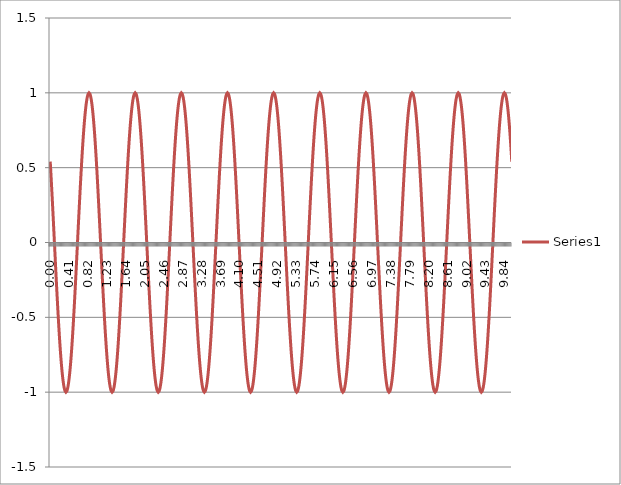
| Category | Series 1 |
|---|---|
| 0.0 | 0.54 |
| 0.01 | 0.486 |
| 0.02 | 0.431 |
| 0.03 | 0.373 |
| 0.04 | 0.314 |
| 0.05 | 0.254 |
| 0.060000000000000005 | 0.193 |
| 0.07 | 0.131 |
| 0.08 | 0.068 |
| 0.09 | 0.005 |
| 0.09999999999999999 | -0.057 |
| 0.10999999999999999 | -0.12 |
| 0.11999999999999998 | -0.182 |
| 0.12999999999999998 | -0.244 |
| 0.13999999999999999 | -0.304 |
| 0.15 | -0.363 |
| 0.16 | -0.421 |
| 0.17 | -0.477 |
| 0.18000000000000002 | -0.531 |
| 0.19000000000000003 | -0.583 |
| 0.20000000000000004 | -0.633 |
| 0.21000000000000005 | -0.681 |
| 0.22000000000000006 | -0.725 |
| 0.23000000000000007 | -0.767 |
| 0.24000000000000007 | -0.806 |
| 0.25000000000000006 | -0.841 |
| 0.26000000000000006 | -0.874 |
| 0.2700000000000001 | -0.903 |
| 0.2800000000000001 | -0.928 |
| 0.2900000000000001 | -0.949 |
| 0.3000000000000001 | -0.967 |
| 0.3100000000000001 | -0.981 |
| 0.3200000000000001 | -0.991 |
| 0.3300000000000001 | -0.998 |
| 0.34000000000000014 | -1 |
| 0.35000000000000014 | -0.998 |
| 0.36000000000000015 | -0.993 |
| 0.37000000000000016 | -0.983 |
| 0.38000000000000017 | -0.97 |
| 0.3900000000000002 | -0.953 |
| 0.4000000000000002 | -0.932 |
| 0.4100000000000002 | -0.907 |
| 0.4200000000000002 | -0.879 |
| 0.4300000000000002 | -0.847 |
| 0.4400000000000002 | -0.812 |
| 0.45000000000000023 | -0.774 |
| 0.46000000000000024 | -0.733 |
| 0.47000000000000025 | -0.688 |
| 0.48000000000000026 | -0.642 |
| 0.49000000000000027 | -0.592 |
| 0.5000000000000002 | -0.54 |
| 0.5100000000000002 | -0.486 |
| 0.5200000000000002 | -0.431 |
| 0.5300000000000002 | -0.373 |
| 0.5400000000000003 | -0.314 |
| 0.5500000000000003 | -0.254 |
| 0.5600000000000003 | -0.193 |
| 0.5700000000000003 | -0.131 |
| 0.5800000000000003 | -0.068 |
| 0.5900000000000003 | -0.005 |
| 0.6000000000000003 | 0.057 |
| 0.6100000000000003 | 0.12 |
| 0.6200000000000003 | 0.182 |
| 0.6300000000000003 | 0.244 |
| 0.6400000000000003 | 0.304 |
| 0.6500000000000004 | 0.363 |
| 0.6600000000000004 | 0.421 |
| 0.6700000000000004 | 0.477 |
| 0.6800000000000004 | 0.531 |
| 0.6900000000000004 | 0.583 |
| 0.7000000000000004 | 0.633 |
| 0.7100000000000004 | 0.681 |
| 0.7200000000000004 | 0.725 |
| 0.7300000000000004 | 0.767 |
| 0.7400000000000004 | 0.806 |
| 0.7500000000000004 | 0.841 |
| 0.7600000000000005 | 0.874 |
| 0.7700000000000005 | 0.903 |
| 0.7800000000000005 | 0.928 |
| 0.7900000000000005 | 0.949 |
| 0.8000000000000005 | 0.967 |
| 0.8100000000000005 | 0.981 |
| 0.8200000000000005 | 0.991 |
| 0.8300000000000005 | 0.998 |
| 0.8400000000000005 | 1 |
| 0.8500000000000005 | 0.998 |
| 0.8600000000000005 | 0.993 |
| 0.8700000000000006 | 0.983 |
| 0.8800000000000006 | 0.97 |
| 0.8900000000000006 | 0.953 |
| 0.9000000000000006 | 0.932 |
| 0.9100000000000006 | 0.907 |
| 0.9200000000000006 | 0.879 |
| 0.9300000000000006 | 0.847 |
| 0.9400000000000006 | 0.812 |
| 0.9500000000000006 | 0.774 |
| 0.9600000000000006 | 0.733 |
| 0.9700000000000006 | 0.688 |
| 0.9800000000000006 | 0.642 |
| 0.9900000000000007 | 0.592 |
| 1.0000000000000007 | 0.54 |
| 1.0100000000000007 | 0.486 |
| 1.0200000000000007 | 0.431 |
| 1.0300000000000007 | 0.373 |
| 1.0400000000000007 | 0.314 |
| 1.0500000000000007 | 0.254 |
| 1.0600000000000007 | 0.193 |
| 1.0700000000000007 | 0.131 |
| 1.0800000000000007 | 0.068 |
| 1.0900000000000007 | 0.005 |
| 1.1000000000000008 | -0.057 |
| 1.1100000000000008 | -0.12 |
| 1.1200000000000008 | -0.182 |
| 1.1300000000000008 | -0.244 |
| 1.1400000000000008 | -0.304 |
| 1.1500000000000008 | -0.363 |
| 1.1600000000000008 | -0.421 |
| 1.1700000000000008 | -0.477 |
| 1.1800000000000008 | -0.531 |
| 1.1900000000000008 | -0.583 |
| 1.2000000000000008 | -0.633 |
| 1.2100000000000009 | -0.681 |
| 1.2200000000000009 | -0.725 |
| 1.2300000000000009 | -0.767 |
| 1.2400000000000009 | -0.806 |
| 1.2500000000000009 | -0.841 |
| 1.260000000000001 | -0.874 |
| 1.270000000000001 | -0.903 |
| 1.280000000000001 | -0.928 |
| 1.290000000000001 | -0.949 |
| 1.300000000000001 | -0.967 |
| 1.310000000000001 | -0.981 |
| 1.320000000000001 | -0.991 |
| 1.330000000000001 | -0.998 |
| 1.340000000000001 | -1 |
| 1.350000000000001 | -0.998 |
| 1.360000000000001 | -0.993 |
| 1.370000000000001 | -0.983 |
| 1.380000000000001 | -0.97 |
| 1.390000000000001 | -0.953 |
| 1.400000000000001 | -0.932 |
| 1.410000000000001 | -0.907 |
| 1.420000000000001 | -0.879 |
| 1.430000000000001 | -0.847 |
| 1.440000000000001 | -0.812 |
| 1.450000000000001 | -0.774 |
| 1.460000000000001 | -0.733 |
| 1.470000000000001 | -0.688 |
| 1.480000000000001 | -0.642 |
| 1.490000000000001 | -0.592 |
| 1.500000000000001 | -0.54 |
| 1.5100000000000011 | -0.486 |
| 1.5200000000000011 | -0.431 |
| 1.5300000000000011 | -0.373 |
| 1.5400000000000011 | -0.314 |
| 1.5500000000000012 | -0.254 |
| 1.5600000000000012 | -0.193 |
| 1.5700000000000012 | -0.131 |
| 1.5800000000000012 | -0.068 |
| 1.5900000000000012 | -0.005 |
| 1.6000000000000012 | 0.057 |
| 1.6100000000000012 | 0.12 |
| 1.6200000000000012 | 0.182 |
| 1.6300000000000012 | 0.244 |
| 1.6400000000000012 | 0.304 |
| 1.6500000000000012 | 0.363 |
| 1.6600000000000013 | 0.421 |
| 1.6700000000000013 | 0.477 |
| 1.6800000000000013 | 0.531 |
| 1.6900000000000013 | 0.583 |
| 1.7000000000000013 | 0.633 |
| 1.7100000000000013 | 0.681 |
| 1.7200000000000013 | 0.725 |
| 1.7300000000000013 | 0.767 |
| 1.7400000000000013 | 0.806 |
| 1.7500000000000013 | 0.841 |
| 1.7600000000000013 | 0.874 |
| 1.7700000000000014 | 0.903 |
| 1.7800000000000014 | 0.928 |
| 1.7900000000000014 | 0.949 |
| 1.8000000000000014 | 0.967 |
| 1.8100000000000014 | 0.981 |
| 1.8200000000000014 | 0.991 |
| 1.8300000000000014 | 0.998 |
| 1.8400000000000014 | 1 |
| 1.8500000000000014 | 0.998 |
| 1.8600000000000014 | 0.993 |
| 1.8700000000000014 | 0.983 |
| 1.8800000000000014 | 0.97 |
| 1.8900000000000015 | 0.953 |
| 1.9000000000000015 | 0.932 |
| 1.9100000000000015 | 0.907 |
| 1.9200000000000015 | 0.879 |
| 1.9300000000000015 | 0.847 |
| 1.9400000000000015 | 0.812 |
| 1.9500000000000015 | 0.774 |
| 1.9600000000000015 | 0.733 |
| 1.9700000000000015 | 0.688 |
| 1.9800000000000015 | 0.642 |
| 1.9900000000000015 | 0.592 |
| 2.0000000000000013 | 0.54 |
| 2.010000000000001 | 0.486 |
| 2.020000000000001 | 0.431 |
| 2.0300000000000007 | 0.373 |
| 2.0400000000000005 | 0.314 |
| 2.0500000000000003 | 0.254 |
| 2.06 | 0.193 |
| 2.07 | 0.131 |
| 2.0799999999999996 | 0.068 |
| 2.0899999999999994 | 0.005 |
| 2.099999999999999 | -0.057 |
| 2.109999999999999 | -0.12 |
| 2.1199999999999988 | -0.182 |
| 2.1299999999999986 | -0.244 |
| 2.1399999999999983 | -0.304 |
| 2.149999999999998 | -0.363 |
| 2.159999999999998 | -0.421 |
| 2.1699999999999977 | -0.477 |
| 2.1799999999999975 | -0.531 |
| 2.1899999999999973 | -0.583 |
| 2.199999999999997 | -0.633 |
| 2.209999999999997 | -0.681 |
| 2.2199999999999966 | -0.725 |
| 2.2299999999999964 | -0.767 |
| 2.239999999999996 | -0.806 |
| 2.249999999999996 | -0.841 |
| 2.259999999999996 | -0.874 |
| 2.2699999999999956 | -0.903 |
| 2.2799999999999954 | -0.928 |
| 2.289999999999995 | -0.949 |
| 2.299999999999995 | -0.967 |
| 2.3099999999999947 | -0.981 |
| 2.3199999999999945 | -0.991 |
| 2.3299999999999943 | -0.998 |
| 2.339999999999994 | -1 |
| 2.349999999999994 | -0.998 |
| 2.3599999999999937 | -0.993 |
| 2.3699999999999934 | -0.983 |
| 2.3799999999999932 | -0.97 |
| 2.389999999999993 | -0.953 |
| 2.399999999999993 | -0.932 |
| 2.4099999999999926 | -0.907 |
| 2.4199999999999924 | -0.879 |
| 2.429999999999992 | -0.847 |
| 2.439999999999992 | -0.812 |
| 2.4499999999999917 | -0.774 |
| 2.4599999999999915 | -0.733 |
| 2.4699999999999913 | -0.688 |
| 2.479999999999991 | -0.642 |
| 2.489999999999991 | -0.592 |
| 2.4999999999999907 | -0.54 |
| 2.5099999999999905 | -0.486 |
| 2.5199999999999902 | -0.431 |
| 2.52999999999999 | -0.373 |
| 2.53999999999999 | -0.314 |
| 2.5499999999999896 | -0.254 |
| 2.5599999999999894 | -0.193 |
| 2.569999999999989 | -0.131 |
| 2.579999999999989 | -0.068 |
| 2.5899999999999888 | -0.005 |
| 2.5999999999999885 | 0.057 |
| 2.6099999999999883 | 0.12 |
| 2.619999999999988 | 0.182 |
| 2.629999999999988 | 0.244 |
| 2.6399999999999877 | 0.304 |
| 2.6499999999999875 | 0.363 |
| 2.6599999999999873 | 0.421 |
| 2.669999999999987 | 0.477 |
| 2.679999999999987 | 0.531 |
| 2.6899999999999866 | 0.583 |
| 2.6999999999999864 | 0.633 |
| 2.709999999999986 | 0.681 |
| 2.719999999999986 | 0.725 |
| 2.7299999999999858 | 0.767 |
| 2.7399999999999856 | 0.806 |
| 2.7499999999999853 | 0.841 |
| 2.759999999999985 | 0.874 |
| 2.769999999999985 | 0.903 |
| 2.7799999999999847 | 0.928 |
| 2.7899999999999845 | 0.949 |
| 2.7999999999999843 | 0.967 |
| 2.809999999999984 | 0.981 |
| 2.819999999999984 | 0.991 |
| 2.8299999999999836 | 0.998 |
| 2.8399999999999834 | 1 |
| 2.849999999999983 | 0.998 |
| 2.859999999999983 | 0.993 |
| 2.869999999999983 | 0.983 |
| 2.8799999999999826 | 0.97 |
| 2.8899999999999824 | 0.953 |
| 2.899999999999982 | 0.932 |
| 2.909999999999982 | 0.907 |
| 2.9199999999999817 | 0.879 |
| 2.9299999999999815 | 0.847 |
| 2.9399999999999813 | 0.812 |
| 2.949999999999981 | 0.774 |
| 2.959999999999981 | 0.733 |
| 2.9699999999999807 | 0.688 |
| 2.9799999999999804 | 0.642 |
| 2.9899999999999802 | 0.592 |
| 2.99999999999998 | 0.54 |
| 3.00999999999998 | 0.486 |
| 3.0199999999999796 | 0.431 |
| 3.0299999999999794 | 0.373 |
| 3.039999999999979 | 0.314 |
| 3.049999999999979 | 0.254 |
| 3.0599999999999787 | 0.193 |
| 3.0699999999999785 | 0.131 |
| 3.0799999999999783 | 0.068 |
| 3.089999999999978 | 0.005 |
| 3.099999999999978 | -0.057 |
| 3.1099999999999777 | -0.12 |
| 3.1199999999999775 | -0.182 |
| 3.1299999999999772 | -0.244 |
| 3.139999999999977 | -0.304 |
| 3.149999999999977 | -0.363 |
| 3.1599999999999766 | -0.421 |
| 3.1699999999999764 | -0.477 |
| 3.179999999999976 | -0.531 |
| 3.189999999999976 | -0.583 |
| 3.1999999999999758 | -0.633 |
| 3.2099999999999755 | -0.681 |
| 3.2199999999999753 | -0.725 |
| 3.229999999999975 | -0.767 |
| 3.239999999999975 | -0.806 |
| 3.2499999999999747 | -0.841 |
| 3.2599999999999745 | -0.874 |
| 3.2699999999999743 | -0.903 |
| 3.279999999999974 | -0.928 |
| 3.289999999999974 | -0.949 |
| 3.2999999999999736 | -0.967 |
| 3.3099999999999734 | -0.981 |
| 3.319999999999973 | -0.991 |
| 3.329999999999973 | -0.998 |
| 3.3399999999999728 | -1 |
| 3.3499999999999726 | -0.998 |
| 3.3599999999999723 | -0.993 |
| 3.369999999999972 | -0.983 |
| 3.379999999999972 | -0.97 |
| 3.3899999999999717 | -0.953 |
| 3.3999999999999715 | -0.932 |
| 3.4099999999999713 | -0.907 |
| 3.419999999999971 | -0.879 |
| 3.429999999999971 | -0.847 |
| 3.4399999999999706 | -0.812 |
| 3.4499999999999704 | -0.774 |
| 3.45999999999997 | -0.733 |
| 3.46999999999997 | -0.688 |
| 3.47999999999997 | -0.642 |
| 3.4899999999999696 | -0.592 |
| 3.4999999999999694 | -0.54 |
| 3.509999999999969 | -0.486 |
| 3.519999999999969 | -0.431 |
| 3.5299999999999687 | -0.373 |
| 3.5399999999999685 | -0.314 |
| 3.5499999999999683 | -0.254 |
| 3.559999999999968 | -0.193 |
| 3.569999999999968 | -0.131 |
| 3.5799999999999677 | -0.068 |
| 3.5899999999999674 | -0.005 |
| 3.5999999999999672 | 0.057 |
| 3.609999999999967 | 0.12 |
| 3.619999999999967 | 0.182 |
| 3.6299999999999666 | 0.244 |
| 3.6399999999999664 | 0.304 |
| 3.649999999999966 | 0.363 |
| 3.659999999999966 | 0.421 |
| 3.6699999999999657 | 0.477 |
| 3.6799999999999655 | 0.531 |
| 3.6899999999999653 | 0.583 |
| 3.699999999999965 | 0.633 |
| 3.709999999999965 | 0.681 |
| 3.7199999999999647 | 0.725 |
| 3.7299999999999645 | 0.767 |
| 3.7399999999999642 | 0.806 |
| 3.749999999999964 | 0.841 |
| 3.759999999999964 | 0.874 |
| 3.7699999999999636 | 0.903 |
| 3.7799999999999634 | 0.928 |
| 3.789999999999963 | 0.949 |
| 3.799999999999963 | 0.967 |
| 3.8099999999999627 | 0.981 |
| 3.8199999999999625 | 0.991 |
| 3.8299999999999623 | 0.998 |
| 3.839999999999962 | 1 |
| 3.849999999999962 | 0.998 |
| 3.8599999999999617 | 0.993 |
| 3.8699999999999615 | 0.983 |
| 3.8799999999999613 | 0.97 |
| 3.889999999999961 | 0.953 |
| 3.899999999999961 | 0.932 |
| 3.9099999999999606 | 0.907 |
| 3.9199999999999604 | 0.879 |
| 3.92999999999996 | 0.847 |
| 3.93999999999996 | 0.812 |
| 3.9499999999999598 | 0.774 |
| 3.9599999999999596 | 0.733 |
| 3.9699999999999593 | 0.688 |
| 3.979999999999959 | 0.642 |
| 3.989999999999959 | 0.592 |
| 3.9999999999999587 | 0.54 |
| 4.009999999999959 | 0.486 |
| 4.019999999999959 | 0.431 |
| 4.0299999999999585 | 0.373 |
| 4.039999999999958 | 0.314 |
| 4.049999999999958 | 0.254 |
| 4.059999999999958 | 0.193 |
| 4.069999999999958 | 0.131 |
| 4.079999999999957 | 0.068 |
| 4.089999999999957 | 0.005 |
| 4.099999999999957 | -0.057 |
| 4.109999999999957 | -0.12 |
| 4.119999999999957 | -0.182 |
| 4.129999999999956 | -0.244 |
| 4.139999999999956 | -0.304 |
| 4.149999999999956 | -0.363 |
| 4.159999999999956 | -0.421 |
| 4.1699999999999555 | -0.477 |
| 4.179999999999955 | -0.531 |
| 4.189999999999955 | -0.583 |
| 4.199999999999955 | -0.633 |
| 4.209999999999955 | -0.681 |
| 4.2199999999999545 | -0.725 |
| 4.229999999999954 | -0.767 |
| 4.239999999999954 | -0.806 |
| 4.249999999999954 | -0.841 |
| 4.259999999999954 | -0.874 |
| 4.269999999999953 | -0.903 |
| 4.279999999999953 | -0.928 |
| 4.289999999999953 | -0.949 |
| 4.299999999999953 | -0.967 |
| 4.3099999999999525 | -0.981 |
| 4.319999999999952 | -0.991 |
| 4.329999999999952 | -0.998 |
| 4.339999999999952 | -1 |
| 4.349999999999952 | -0.998 |
| 4.3599999999999515 | -0.993 |
| 4.369999999999951 | -0.983 |
| 4.379999999999951 | -0.97 |
| 4.389999999999951 | -0.953 |
| 4.399999999999951 | -0.932 |
| 4.40999999999995 | -0.907 |
| 4.41999999999995 | -0.879 |
| 4.42999999999995 | -0.847 |
| 4.43999999999995 | -0.812 |
| 4.4499999999999496 | -0.774 |
| 4.459999999999949 | -0.733 |
| 4.469999999999949 | -0.688 |
| 4.479999999999949 | -0.642 |
| 4.489999999999949 | -0.592 |
| 4.4999999999999485 | -0.54 |
| 4.509999999999948 | -0.486 |
| 4.519999999999948 | -0.431 |
| 4.529999999999948 | -0.373 |
| 4.539999999999948 | -0.314 |
| 4.549999999999947 | -0.254 |
| 4.559999999999947 | -0.193 |
| 4.569999999999947 | -0.131 |
| 4.579999999999947 | -0.068 |
| 4.589999999999947 | -0.005 |
| 4.599999999999946 | 0.057 |
| 4.609999999999946 | 0.12 |
| 4.619999999999946 | 0.182 |
| 4.629999999999946 | 0.244 |
| 4.6399999999999455 | 0.304 |
| 4.649999999999945 | 0.363 |
| 4.659999999999945 | 0.421 |
| 4.669999999999945 | 0.477 |
| 4.679999999999945 | 0.531 |
| 4.689999999999944 | 0.583 |
| 4.699999999999944 | 0.633 |
| 4.709999999999944 | 0.681 |
| 4.719999999999944 | 0.725 |
| 4.729999999999944 | 0.767 |
| 4.739999999999943 | 0.806 |
| 4.749999999999943 | 0.841 |
| 4.759999999999943 | 0.874 |
| 4.769999999999943 | 0.903 |
| 4.7799999999999425 | 0.928 |
| 4.789999999999942 | 0.949 |
| 4.799999999999942 | 0.967 |
| 4.809999999999942 | 0.981 |
| 4.819999999999942 | 0.991 |
| 4.8299999999999415 | 0.998 |
| 4.839999999999941 | 1 |
| 4.849999999999941 | 0.998 |
| 4.859999999999941 | 0.993 |
| 4.869999999999941 | 0.983 |
| 4.87999999999994 | 0.97 |
| 4.88999999999994 | 0.953 |
| 4.89999999999994 | 0.932 |
| 4.90999999999994 | 0.907 |
| 4.9199999999999395 | 0.879 |
| 4.929999999999939 | 0.847 |
| 4.939999999999939 | 0.812 |
| 4.949999999999939 | 0.774 |
| 4.959999999999939 | 0.733 |
| 4.9699999999999385 | 0.688 |
| 4.979999999999938 | 0.642 |
| 4.989999999999938 | 0.592 |
| 4.999999999999938 | 0.54 |
| 5.009999999999938 | 0.486 |
| 5.019999999999937 | 0.431 |
| 5.029999999999937 | 0.373 |
| 5.039999999999937 | 0.314 |
| 5.049999999999937 | 0.254 |
| 5.0599999999999365 | 0.193 |
| 5.069999999999936 | 0.131 |
| 5.079999999999936 | 0.068 |
| 5.089999999999936 | 0.005 |
| 5.099999999999936 | -0.057 |
| 5.1099999999999355 | -0.12 |
| 5.119999999999935 | -0.182 |
| 5.129999999999935 | -0.244 |
| 5.139999999999935 | -0.304 |
| 5.149999999999935 | -0.363 |
| 5.159999999999934 | -0.421 |
| 5.169999999999934 | -0.477 |
| 5.179999999999934 | -0.531 |
| 5.189999999999934 | -0.583 |
| 5.199999999999934 | -0.633 |
| 5.209999999999933 | -0.681 |
| 5.219999999999933 | -0.725 |
| 5.229999999999933 | -0.767 |
| 5.239999999999933 | -0.806 |
| 5.2499999999999325 | -0.841 |
| 5.259999999999932 | -0.874 |
| 5.269999999999932 | -0.903 |
| 5.279999999999932 | -0.928 |
| 5.289999999999932 | -0.949 |
| 5.299999999999931 | -0.967 |
| 5.309999999999931 | -0.981 |
| 5.319999999999931 | -0.991 |
| 5.329999999999931 | -0.998 |
| 5.339999999999931 | -1 |
| 5.34999999999993 | -0.998 |
| 5.35999999999993 | -0.993 |
| 5.36999999999993 | -0.983 |
| 5.37999999999993 | -0.97 |
| 5.3899999999999295 | -0.953 |
| 5.399999999999929 | -0.932 |
| 5.409999999999929 | -0.907 |
| 5.419999999999929 | -0.879 |
| 5.429999999999929 | -0.847 |
| 5.4399999999999284 | -0.812 |
| 5.449999999999928 | -0.774 |
| 5.459999999999928 | -0.733 |
| 5.469999999999928 | -0.688 |
| 5.479999999999928 | -0.642 |
| 5.489999999999927 | -0.592 |
| 5.499999999999927 | -0.54 |
| 5.509999999999927 | -0.486 |
| 5.519999999999927 | -0.431 |
| 5.5299999999999265 | -0.373 |
| 5.539999999999926 | -0.314 |
| 5.549999999999926 | -0.254 |
| 5.559999999999926 | -0.193 |
| 5.569999999999926 | -0.131 |
| 5.5799999999999255 | -0.068 |
| 5.589999999999925 | -0.005 |
| 5.599999999999925 | 0.057 |
| 5.609999999999925 | 0.12 |
| 5.619999999999925 | 0.182 |
| 5.629999999999924 | 0.244 |
| 5.639999999999924 | 0.304 |
| 5.649999999999924 | 0.363 |
| 5.659999999999924 | 0.421 |
| 5.6699999999999235 | 0.477 |
| 5.679999999999923 | 0.531 |
| 5.689999999999923 | 0.583 |
| 5.699999999999923 | 0.633 |
| 5.709999999999923 | 0.681 |
| 5.7199999999999225 | 0.725 |
| 5.729999999999922 | 0.767 |
| 5.739999999999922 | 0.806 |
| 5.749999999999922 | 0.841 |
| 5.759999999999922 | 0.874 |
| 5.769999999999921 | 0.903 |
| 5.779999999999921 | 0.928 |
| 5.789999999999921 | 0.949 |
| 5.799999999999921 | 0.967 |
| 5.809999999999921 | 0.981 |
| 5.81999999999992 | 0.991 |
| 5.82999999999992 | 0.998 |
| 5.83999999999992 | 1 |
| 5.84999999999992 | 0.998 |
| 5.8599999999999195 | 0.993 |
| 5.869999999999919 | 0.983 |
| 5.879999999999919 | 0.97 |
| 5.889999999999919 | 0.953 |
| 5.899999999999919 | 0.932 |
| 5.909999999999918 | 0.907 |
| 5.919999999999918 | 0.879 |
| 5.929999999999918 | 0.847 |
| 5.939999999999918 | 0.812 |
| 5.949999999999918 | 0.774 |
| 5.959999999999917 | 0.733 |
| 5.969999999999917 | 0.688 |
| 5.979999999999917 | 0.642 |
| 5.989999999999917 | 0.592 |
| 5.9999999999999165 | 0.54 |
| 6.009999999999916 | 0.486 |
| 6.019999999999916 | 0.431 |
| 6.029999999999916 | 0.373 |
| 6.039999999999916 | 0.314 |
| 6.0499999999999154 | 0.254 |
| 6.059999999999915 | 0.193 |
| 6.069999999999915 | 0.131 |
| 6.079999999999915 | 0.068 |
| 6.089999999999915 | 0.005 |
| 6.099999999999914 | -0.057 |
| 6.109999999999914 | -0.12 |
| 6.119999999999914 | -0.182 |
| 6.129999999999914 | -0.244 |
| 6.1399999999999135 | -0.304 |
| 6.149999999999913 | -0.363 |
| 6.159999999999913 | -0.421 |
| 6.169999999999913 | -0.477 |
| 6.179999999999913 | -0.531 |
| 6.1899999999999125 | -0.583 |
| 6.199999999999912 | -0.633 |
| 6.209999999999912 | -0.681 |
| 6.219999999999912 | -0.725 |
| 6.229999999999912 | -0.767 |
| 6.239999999999911 | -0.806 |
| 6.249999999999911 | -0.841 |
| 6.259999999999911 | -0.874 |
| 6.269999999999911 | -0.903 |
| 6.2799999999999105 | -0.928 |
| 6.28999999999991 | -0.949 |
| 6.29999999999991 | -0.967 |
| 6.30999999999991 | -0.981 |
| 6.31999999999991 | -0.991 |
| 6.3299999999999095 | -0.998 |
| 6.339999999999909 | -1 |
| 6.349999999999909 | -0.998 |
| 6.359999999999909 | -0.993 |
| 6.369999999999909 | -0.983 |
| 6.379999999999908 | -0.97 |
| 6.389999999999908 | -0.953 |
| 6.399999999999908 | -0.932 |
| 6.409999999999908 | -0.907 |
| 6.419999999999908 | -0.879 |
| 6.429999999999907 | -0.847 |
| 6.439999999999907 | -0.812 |
| 6.449999999999907 | -0.774 |
| 6.459999999999907 | -0.733 |
| 6.4699999999999065 | -0.688 |
| 6.479999999999906 | -0.642 |
| 6.489999999999906 | -0.592 |
| 6.499999999999906 | -0.54 |
| 6.509999999999906 | -0.486 |
| 6.519999999999905 | -0.431 |
| 6.529999999999905 | -0.373 |
| 6.539999999999905 | -0.314 |
| 6.549999999999905 | -0.254 |
| 6.559999999999905 | -0.193 |
| 6.569999999999904 | -0.131 |
| 6.579999999999904 | -0.068 |
| 6.589999999999904 | -0.005 |
| 6.599999999999904 | 0.057 |
| 6.6099999999999035 | 0.12 |
| 6.619999999999903 | 0.182 |
| 6.629999999999903 | 0.244 |
| 6.639999999999903 | 0.304 |
| 6.649999999999903 | 0.363 |
| 6.659999999999902 | 0.421 |
| 6.669999999999902 | 0.477 |
| 6.679999999999902 | 0.531 |
| 6.689999999999902 | 0.583 |
| 6.699999999999902 | 0.633 |
| 6.709999999999901 | 0.681 |
| 6.719999999999901 | 0.725 |
| 6.729999999999901 | 0.767 |
| 6.739999999999901 | 0.806 |
| 6.7499999999999005 | 0.841 |
| 6.7599999999999 | 0.874 |
| 6.7699999999999 | 0.903 |
| 6.7799999999999 | 0.928 |
| 6.7899999999999 | 0.949 |
| 6.7999999999998995 | 0.967 |
| 6.809999999999899 | 0.981 |
| 6.819999999999899 | 0.991 |
| 6.829999999999899 | 0.998 |
| 6.839999999999899 | 1 |
| 6.849999999999898 | 0.998 |
| 6.859999999999898 | 0.993 |
| 6.869999999999898 | 0.983 |
| 6.879999999999898 | 0.97 |
| 6.8899999999998975 | 0.953 |
| 6.899999999999897 | 0.932 |
| 6.909999999999897 | 0.907 |
| 6.919999999999897 | 0.879 |
| 6.929999999999897 | 0.847 |
| 6.9399999999998965 | 0.812 |
| 6.949999999999896 | 0.774 |
| 6.959999999999896 | 0.733 |
| 6.969999999999896 | 0.688 |
| 6.979999999999896 | 0.642 |
| 6.989999999999895 | 0.592 |
| 6.999999999999895 | 0.54 |
| 7.009999999999895 | 0.486 |
| 7.019999999999895 | 0.431 |
| 7.0299999999998946 | 0.373 |
| 7.039999999999894 | 0.314 |
| 7.049999999999894 | 0.254 |
| 7.059999999999894 | 0.193 |
| 7.069999999999894 | 0.131 |
| 7.0799999999998935 | 0.068 |
| 7.089999999999893 | 0.005 |
| 7.099999999999893 | -0.057 |
| 7.109999999999893 | -0.12 |
| 7.119999999999893 | -0.182 |
| 7.129999999999892 | -0.244 |
| 7.139999999999892 | -0.304 |
| 7.149999999999892 | -0.363 |
| 7.159999999999892 | -0.421 |
| 7.169999999999892 | -0.477 |
| 7.179999999999891 | -0.531 |
| 7.189999999999891 | -0.583 |
| 7.199999999999891 | -0.633 |
| 7.209999999999891 | -0.681 |
| 7.2199999999998905 | -0.725 |
| 7.22999999999989 | -0.767 |
| 7.23999999999989 | -0.806 |
| 7.24999999999989 | -0.841 |
| 7.25999999999989 | -0.874 |
| 7.269999999999889 | -0.903 |
| 7.279999999999889 | -0.928 |
| 7.289999999999889 | -0.949 |
| 7.299999999999889 | -0.967 |
| 7.309999999999889 | -0.981 |
| 7.319999999999888 | -0.991 |
| 7.329999999999888 | -0.998 |
| 7.339999999999888 | -1 |
| 7.349999999999888 | -0.998 |
| 7.3599999999998875 | -0.993 |
| 7.369999999999887 | -0.983 |
| 7.379999999999887 | -0.97 |
| 7.389999999999887 | -0.953 |
| 7.399999999999887 | -0.932 |
| 7.4099999999998865 | -0.907 |
| 7.419999999999886 | -0.879 |
| 7.429999999999886 | -0.847 |
| 7.439999999999886 | -0.812 |
| 7.449999999999886 | -0.774 |
| 7.459999999999885 | -0.733 |
| 7.469999999999885 | -0.688 |
| 7.479999999999885 | -0.642 |
| 7.489999999999885 | -0.592 |
| 7.4999999999998845 | -0.54 |
| 7.509999999999884 | -0.486 |
| 7.519999999999884 | -0.431 |
| 7.529999999999884 | -0.373 |
| 7.539999999999884 | -0.314 |
| 7.5499999999998835 | -0.254 |
| 7.559999999999883 | -0.193 |
| 7.569999999999883 | -0.131 |
| 7.579999999999883 | -0.068 |
| 7.589999999999883 | -0.005 |
| 7.599999999999882 | 0.057 |
| 7.609999999999882 | 0.12 |
| 7.619999999999882 | 0.182 |
| 7.629999999999882 | 0.244 |
| 7.6399999999998816 | 0.304 |
| 7.649999999999881 | 0.363 |
| 7.659999999999881 | 0.421 |
| 7.669999999999881 | 0.477 |
| 7.679999999999881 | 0.531 |
| 7.6899999999998805 | 0.583 |
| 7.69999999999988 | 0.633 |
| 7.70999999999988 | 0.681 |
| 7.71999999999988 | 0.725 |
| 7.72999999999988 | 0.767 |
| 7.739999999999879 | 0.806 |
| 7.749999999999879 | 0.841 |
| 7.759999999999879 | 0.874 |
| 7.769999999999879 | 0.903 |
| 7.779999999999879 | 0.928 |
| 7.789999999999878 | 0.949 |
| 7.799999999999878 | 0.967 |
| 7.809999999999878 | 0.981 |
| 7.819999999999878 | 0.991 |
| 7.8299999999998775 | 0.998 |
| 7.839999999999877 | 1 |
| 7.849999999999877 | 0.998 |
| 7.859999999999877 | 0.993 |
| 7.869999999999877 | 0.983 |
| 7.879999999999876 | 0.97 |
| 7.889999999999876 | 0.953 |
| 7.899999999999876 | 0.932 |
| 7.909999999999876 | 0.907 |
| 7.919999999999876 | 0.879 |
| 7.929999999999875 | 0.847 |
| 7.939999999999875 | 0.812 |
| 7.949999999999875 | 0.774 |
| 7.959999999999875 | 0.733 |
| 7.9699999999998745 | 0.688 |
| 7.979999999999874 | 0.642 |
| 7.989999999999874 | 0.592 |
| 7.999999999999874 | 0.54 |
| 8.009999999999874 | 0.486 |
| 8.019999999999873 | 0.431 |
| 8.029999999999873 | 0.373 |
| 8.039999999999873 | 0.314 |
| 8.049999999999873 | 0.254 |
| 8.059999999999873 | 0.193 |
| 8.069999999999872 | 0.131 |
| 8.079999999999872 | 0.068 |
| 8.089999999999872 | 0.005 |
| 8.099999999999872 | -0.057 |
| 8.109999999999872 | -0.12 |
| 8.119999999999871 | -0.182 |
| 8.129999999999871 | -0.244 |
| 8.139999999999871 | -0.304 |
| 8.14999999999987 | -0.363 |
| 8.15999999999987 | -0.421 |
| 8.16999999999987 | -0.477 |
| 8.17999999999987 | -0.531 |
| 8.18999999999987 | -0.583 |
| 8.19999999999987 | -0.633 |
| 8.20999999999987 | -0.681 |
| 8.21999999999987 | -0.725 |
| 8.229999999999869 | -0.767 |
| 8.239999999999869 | -0.806 |
| 8.249999999999869 | -0.841 |
| 8.259999999999868 | -0.874 |
| 8.269999999999868 | -0.903 |
| 8.279999999999868 | -0.928 |
| 8.289999999999868 | -0.949 |
| 8.299999999999867 | -0.967 |
| 8.309999999999867 | -0.981 |
| 8.319999999999867 | -0.991 |
| 8.329999999999867 | -0.998 |
| 8.339999999999867 | -1 |
| 8.349999999999866 | -0.998 |
| 8.359999999999866 | -0.993 |
| 8.369999999999866 | -0.983 |
| 8.379999999999866 | -0.97 |
| 8.389999999999866 | -0.953 |
| 8.399999999999865 | -0.932 |
| 8.409999999999865 | -0.907 |
| 8.419999999999865 | -0.879 |
| 8.429999999999865 | -0.847 |
| 8.439999999999864 | -0.812 |
| 8.449999999999864 | -0.774 |
| 8.459999999999864 | -0.733 |
| 8.469999999999864 | -0.688 |
| 8.479999999999864 | -0.642 |
| 8.489999999999863 | -0.592 |
| 8.499999999999863 | -0.54 |
| 8.509999999999863 | -0.486 |
| 8.519999999999863 | -0.431 |
| 8.529999999999863 | -0.373 |
| 8.539999999999862 | -0.314 |
| 8.549999999999862 | -0.254 |
| 8.559999999999862 | -0.193 |
| 8.569999999999862 | -0.131 |
| 8.579999999999862 | -0.068 |
| 8.589999999999861 | -0.005 |
| 8.599999999999861 | 0.057 |
| 8.60999999999986 | 0.12 |
| 8.61999999999986 | 0.182 |
| 8.62999999999986 | 0.244 |
| 8.63999999999986 | 0.304 |
| 8.64999999999986 | 0.363 |
| 8.65999999999986 | 0.421 |
| 8.66999999999986 | 0.477 |
| 8.67999999999986 | 0.531 |
| 8.68999999999986 | 0.583 |
| 8.699999999999859 | 0.633 |
| 8.709999999999859 | 0.681 |
| 8.719999999999859 | 0.725 |
| 8.729999999999858 | 0.767 |
| 8.739999999999858 | 0.806 |
| 8.749999999999858 | 0.841 |
| 8.759999999999858 | 0.874 |
| 8.769999999999857 | 0.903 |
| 8.779999999999857 | 0.928 |
| 8.789999999999857 | 0.949 |
| 8.799999999999857 | 0.967 |
| 8.809999999999857 | 0.981 |
| 8.819999999999856 | 0.991 |
| 8.829999999999856 | 0.998 |
| 8.839999999999856 | 1 |
| 8.849999999999856 | 0.998 |
| 8.859999999999856 | 0.993 |
| 8.869999999999855 | 0.983 |
| 8.879999999999855 | 0.97 |
| 8.889999999999855 | 0.953 |
| 8.899999999999855 | 0.932 |
| 8.909999999999854 | 0.907 |
| 8.919999999999854 | 0.879 |
| 8.929999999999854 | 0.847 |
| 8.939999999999854 | 0.812 |
| 8.949999999999854 | 0.774 |
| 8.959999999999853 | 0.733 |
| 8.969999999999853 | 0.688 |
| 8.979999999999853 | 0.642 |
| 8.989999999999853 | 0.592 |
| 8.999999999999853 | 0.54 |
| 9.009999999999852 | 0.486 |
| 9.019999999999852 | 0.431 |
| 9.029999999999852 | 0.373 |
| 9.039999999999852 | 0.314 |
| 9.049999999999851 | 0.254 |
| 9.059999999999851 | 0.193 |
| 9.069999999999851 | 0.131 |
| 9.07999999999985 | 0.068 |
| 9.08999999999985 | 0.005 |
| 9.09999999999985 | -0.057 |
| 9.10999999999985 | -0.12 |
| 9.11999999999985 | -0.182 |
| 9.12999999999985 | -0.244 |
| 9.13999999999985 | -0.304 |
| 9.14999999999985 | -0.363 |
| 9.15999999999985 | -0.421 |
| 9.169999999999849 | -0.477 |
| 9.179999999999849 | -0.531 |
| 9.189999999999849 | -0.583 |
| 9.199999999999848 | -0.633 |
| 9.209999999999848 | -0.681 |
| 9.219999999999848 | -0.725 |
| 9.229999999999848 | -0.767 |
| 9.239999999999847 | -0.806 |
| 9.249999999999847 | -0.841 |
| 9.259999999999847 | -0.874 |
| 9.269999999999847 | -0.903 |
| 9.279999999999847 | -0.928 |
| 9.289999999999846 | -0.949 |
| 9.299999999999846 | -0.967 |
| 9.309999999999846 | -0.981 |
| 9.319999999999846 | -0.991 |
| 9.329999999999846 | -0.998 |
| 9.339999999999845 | -1 |
| 9.349999999999845 | -0.998 |
| 9.359999999999845 | -0.993 |
| 9.369999999999845 | -0.983 |
| 9.379999999999844 | -0.97 |
| 9.389999999999844 | -0.953 |
| 9.399999999999844 | -0.932 |
| 9.409999999999844 | -0.907 |
| 9.419999999999844 | -0.879 |
| 9.429999999999843 | -0.847 |
| 9.439999999999843 | -0.812 |
| 9.449999999999843 | -0.774 |
| 9.459999999999843 | -0.733 |
| 9.469999999999843 | -0.688 |
| 9.479999999999842 | -0.642 |
| 9.489999999999842 | -0.592 |
| 9.499999999999842 | -0.54 |
| 9.509999999999842 | -0.486 |
| 9.519999999999841 | -0.431 |
| 9.529999999999841 | -0.373 |
| 9.539999999999841 | -0.314 |
| 9.54999999999984 | -0.254 |
| 9.55999999999984 | -0.193 |
| 9.56999999999984 | -0.131 |
| 9.57999999999984 | -0.068 |
| 9.58999999999984 | -0.005 |
| 9.59999999999984 | 0.057 |
| 9.60999999999984 | 0.12 |
| 9.61999999999984 | 0.182 |
| 9.62999999999984 | 0.244 |
| 9.639999999999839 | 0.304 |
| 9.649999999999839 | 0.363 |
| 9.659999999999838 | 0.421 |
| 9.669999999999838 | 0.477 |
| 9.679999999999838 | 0.531 |
| 9.689999999999838 | 0.583 |
| 9.699999999999838 | 0.633 |
| 9.709999999999837 | 0.681 |
| 9.719999999999837 | 0.725 |
| 9.729999999999837 | 0.767 |
| 9.739999999999837 | 0.806 |
| 9.749999999999837 | 0.841 |
| 9.759999999999836 | 0.874 |
| 9.769999999999836 | 0.903 |
| 9.779999999999836 | 0.928 |
| 9.789999999999836 | 0.949 |
| 9.799999999999836 | 0.967 |
| 9.809999999999835 | 0.981 |
| 9.819999999999835 | 0.991 |
| 9.829999999999835 | 0.998 |
| 9.839999999999835 | 1 |
| 9.849999999999834 | 0.998 |
| 9.859999999999834 | 0.993 |
| 9.869999999999834 | 0.983 |
| 9.879999999999834 | 0.97 |
| 9.889999999999834 | 0.953 |
| 9.899999999999833 | 0.932 |
| 9.909999999999833 | 0.907 |
| 9.919999999999833 | 0.879 |
| 9.929999999999833 | 0.847 |
| 9.939999999999833 | 0.812 |
| 9.949999999999832 | 0.774 |
| 9.959999999999832 | 0.733 |
| 9.969999999999832 | 0.688 |
| 9.979999999999832 | 0.642 |
| 9.989999999999831 | 0.592 |
| 9.999999999999831 | 0.54 |